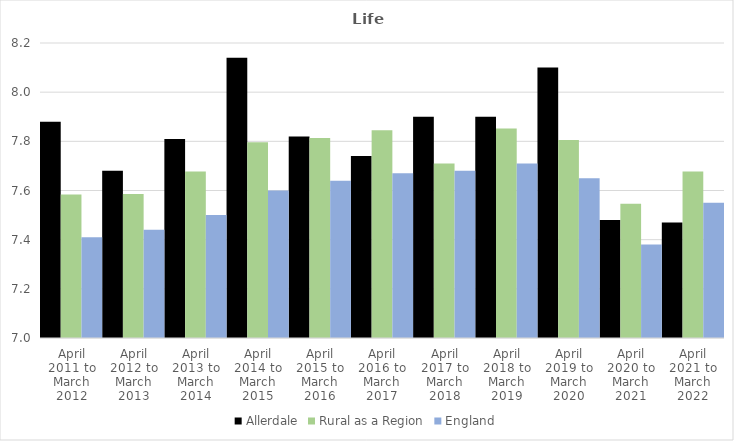
| Category | Allerdale | Rural as a Region | England |
|---|---|---|---|
| April 2011 to March 2012 | 7.88 | 7.584 | 7.41 |
| April 2012 to March 2013 | 7.68 | 7.586 | 7.44 |
| April 2013 to March 2014 | 7.81 | 7.677 | 7.5 |
| April 2014 to March 2015 | 8.14 | 7.797 | 7.6 |
| April 2015 to March 2016 | 7.82 | 7.813 | 7.64 |
| April 2016 to March 2017 | 7.74 | 7.845 | 7.67 |
| April 2017 to March 2018 | 7.9 | 7.71 | 7.68 |
| April 2018 to March 2019 | 7.9 | 7.852 | 7.71 |
| April 2019 to March 2020 | 8.1 | 7.806 | 7.65 |
| April 2020 to March 2021 | 7.48 | 7.546 | 7.38 |
| April 2021 to March 2022 | 7.47 | 7.677 | 7.55 |